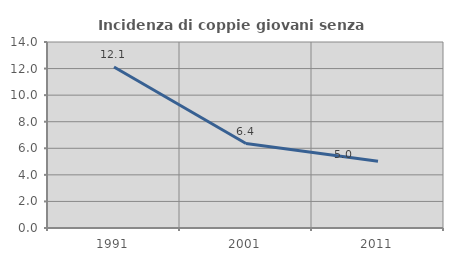
| Category | Incidenza di coppie giovani senza figli |
|---|---|
| 1991.0 | 12.121 |
| 2001.0 | 6.358 |
| 2011.0 | 5.025 |